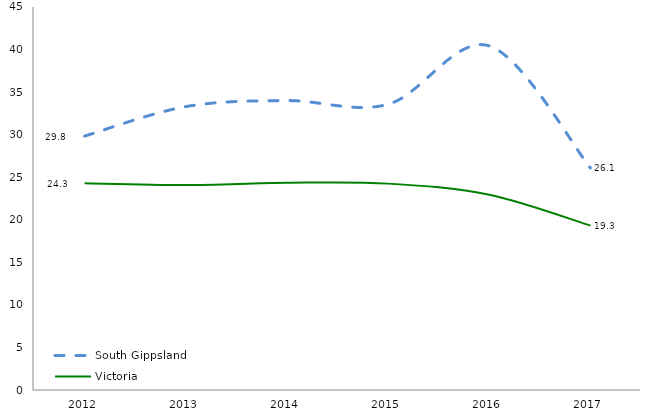
| Category | South Gippsland | Victoria |
|---|---|---|
| 2012.0 | 29.836 | 24.284 |
| 2013.0 | 33.298 | 24.077 |
| 2014.0 | 34.005 | 24.344 |
| 2015.0 | 33.567 | 24.248 |
| 2016.0 | 40.434 | 22.94 |
| 2017.0 | 26.095 | 19.315 |